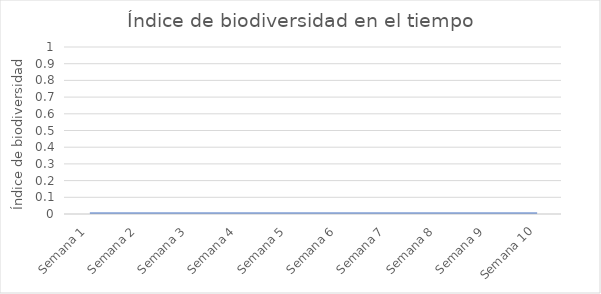
| Category | Series 0 |
|---|---|
| Semana 1 | 0 |
| Semana 2 | 0 |
| Semana 3 | 0 |
| Semana 4 | 0 |
| Semana 5 | 0 |
| Semana 6 | 0 |
| Semana 7 | 0 |
| Semana 8 | 0 |
| Semana 9 | 0 |
| Semana 10 | 0 |